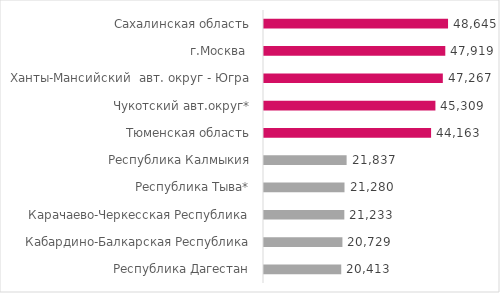
| Category | Средняя ежемесячная пенсия+выплаты со вкдада, руб |
|---|---|
| Республика Дагестан | 20412.779 |
| Кабардино-Балкарская Республика | 20729.184 |
| Карачаево-Черкесская Республика | 21233.189 |
| Республика Тыва* | 21279.767 |
| Республика Калмыкия | 21836.805 |
| Тюменская область | 44163.139 |
| Чукотский авт.округ* | 45308.584 |
| Ханты-Мансийский  авт. округ - Югра | 47266.825 |
| г.Москва  | 47918.633 |
| Сахалинская область | 48645.413 |